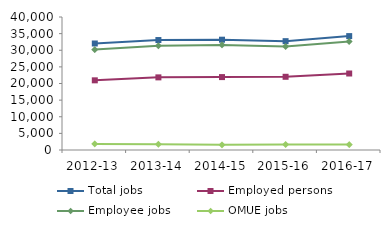
| Category | Total jobs | Employed persons | Employee jobs | OMUE jobs |
|---|---|---|---|---|
| 2012-13 | 32033 | 20953 | 30201 | 1829 |
| 2013-14 | 33072 | 21843 | 31342 | 1731 |
| 2014-15 | 33174 | 21927 | 31605 | 1567 |
| 2015-16 | 32734 | 22019 | 31098 | 1636 |
| 2016-17 | 34256 | 23008 | 32625 | 1631 |